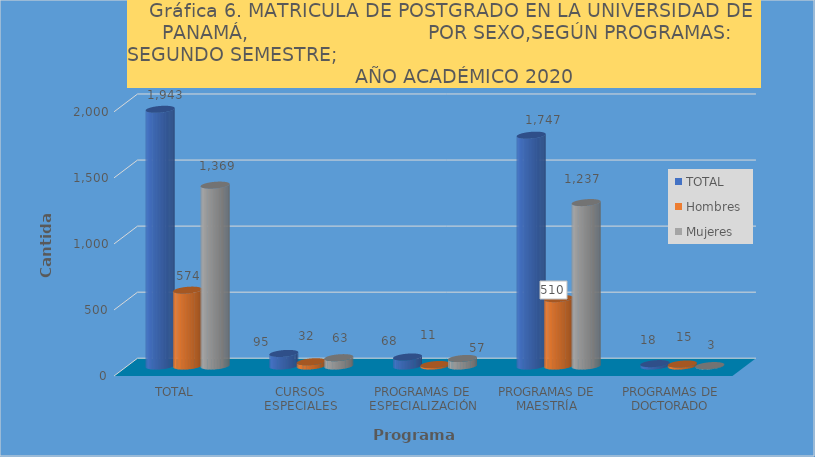
| Category | TOTAL | Hombres | Mujeres |
|---|---|---|---|
| TOTAL | 1943 | 574 | 1369 |
| CURSOS ESPECIALES | 95 | 32 | 63 |
| PROGRAMAS DE ESPECIALIZACIÓN | 68 | 11 | 57 |
| PROGRAMAS DE MAESTRÍA | 1747 | 510 | 1237 |
| PROGRAMAS DE DOCTORADO | 18 | 15 | 3 |